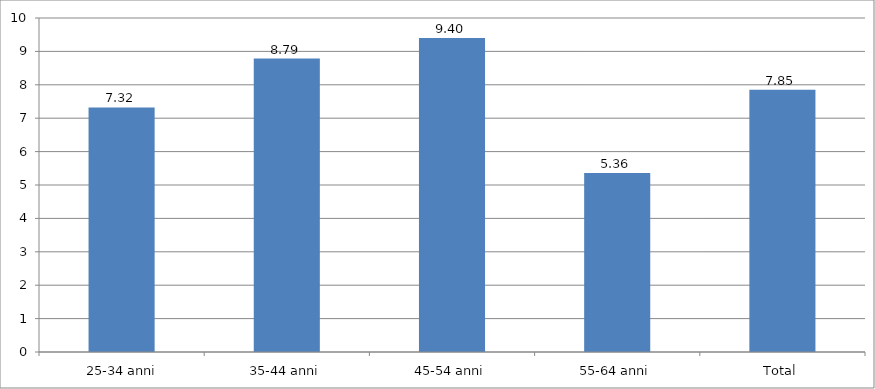
| Category | Series 0 |
|---|---|
|  25-34 anni | 7.321 |
| 35-44 anni | 8.785 |
| 45-54 anni | 9.399 |
| 55-64 anni | 5.363 |
| Total | 7.852 |